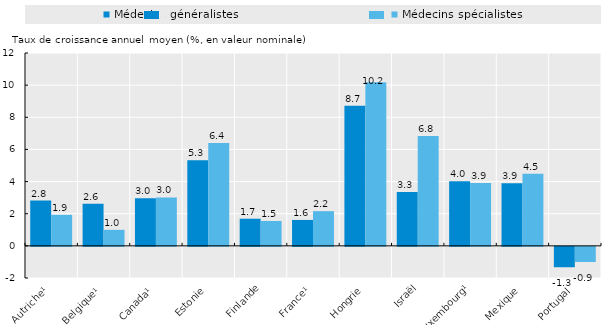
| Category | Médecins généralistes | Médecins spécialistes |
|---|---|---|
| Autriche¹ | 2.819 | 1.931 |
| Belgique¹ | 2.623 | 0.996 |
| Canada¹ | 2.959 | 3.015 |
| Estonie | 5.332 | 6.393 |
| Finlande | 1.689 | 1.549 |
| France¹ | 1.612 | 2.157 |
| Hongrie | 8.71 | 10.174 |
| Israël | 3.348 | 6.834 |
| Luxembourg¹ | 4.023 | 3.916 |
| Mexique | 3.894 | 4.484 |
| Portugal | -1.268 | -0.941 |